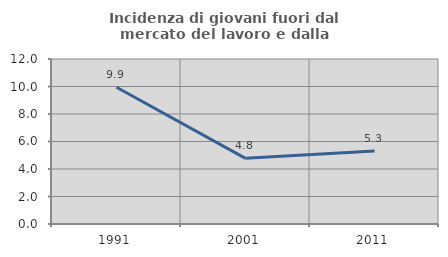
| Category | Incidenza di giovani fuori dal mercato del lavoro e dalla formazione  |
|---|---|
| 1991.0 | 9.944 |
| 2001.0 | 4.775 |
| 2011.0 | 5.3 |